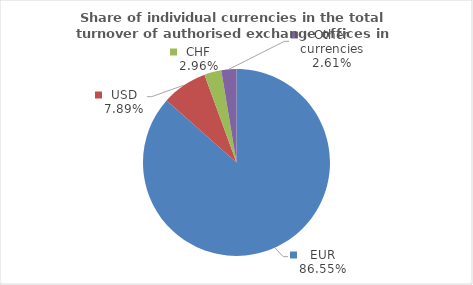
| Category | Series 0 |
|---|---|
| EUR | 86.551 |
| USD | 7.887 |
| CHF | 2.952 |
| Other currencies | 2.61 |